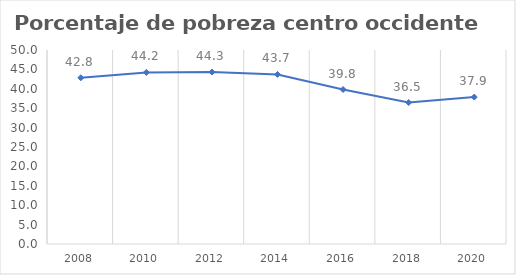
| Category | Series 0 |
|---|---|
| 2008.0 | 42.845 |
| 2010.0 | 44.226 |
| 2012.0 | 44.33 |
| 2014.0 | 43.706 |
| 2016.0 | 39.811 |
| 2018.0 | 36.46 |
| 2020.0 | 37.874 |